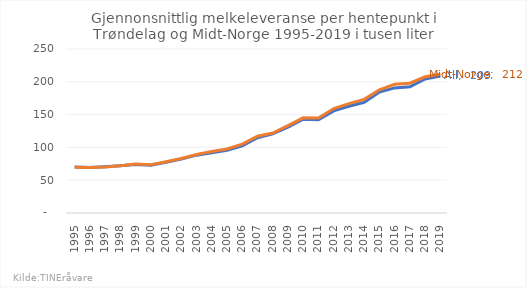
| Category | All | Midt-Norge |
|---|---|---|
| 1995.0 | 70.097 | 69.827 |
| 1996.0 | 69.466 | 69.349 |
| 1997.0 | 70.615 | 70.277 |
| 1998.0 | 72.193 | 72.033 |
| 1999.0 | 73.844 | 74.708 |
| 2000.0 | 72.874 | 73.595 |
| 2001.0 | 77.243 | 78.126 |
| 2002.0 | 82.331 | 83.063 |
| 2003.0 | 88.159 | 89.255 |
| 2004.0 | 91.962 | 93.686 |
| 2005.0 | 95.549 | 97.616 |
| 2006.0 | 102.409 | 105.084 |
| 2007.0 | 114.677 | 117.058 |
| 2008.0 | 120.73 | 121.823 |
| 2009.0 | 131.049 | 133.141 |
| 2010.0 | 142.965 | 145.013 |
| 2011.0 | 142.278 | 144.924 |
| 2012.0 | 155.641 | 159.203 |
| 2013.0 | 162.792 | 166.798 |
| 2014.0 | 168.587 | 173.206 |
| 2015.0 | 184.439 | 187.747 |
| 2016.0 | 190.668 | 196.138 |
| 2017.0 | 192.455 | 197.86 |
| 2018.0 | 204.269 | 207.682 |
| 2019.0 | 208.914 | 211.699 |